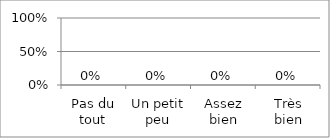
| Category | Series 0 |
|---|---|
| Pas du tout | 0 |
| Un petit peu | 0 |
| Assez bien | 0 |
| Très bien | 0 |